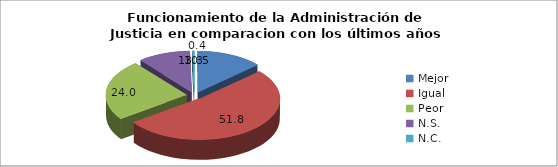
| Category | % |
|---|---|
| Mejor | 13.3 |
| Igual  | 51.8 |
| Peor | 24 |
| N.S.  | 10.5 |
| N.C.  | 0.4 |